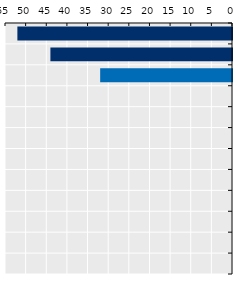
| Category | Length in weeks |
|---|---|
| Korea | 52 |
| Japan | 44 |
| OECD average | 31.941 |
| Viet Nam* | 0 |
| New Zealand | 0 |
| Australia | 0 |
| Singapore* | 0 |
| Mongolia* | 0 |
| Indonesia* | 0 |
| Thailand* | 0 |
| China | 0 |
| Malaysia* | 0 |